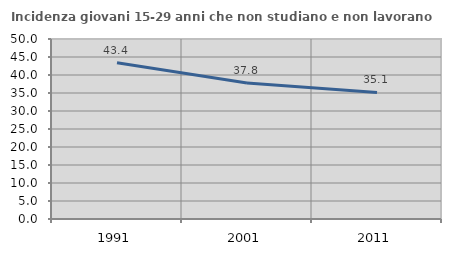
| Category | Incidenza giovani 15-29 anni che non studiano e non lavorano  |
|---|---|
| 1991.0 | 43.39 |
| 2001.0 | 37.752 |
| 2011.0 | 35.141 |